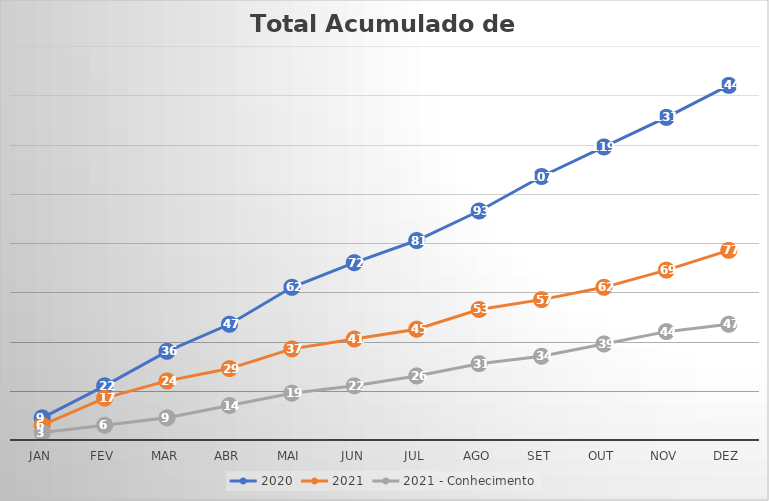
| Category | 2020 | 2021 | 2021 - Conhecimento |
|---|---|---|---|
| Jan | 9 | 6 | 3 |
| Fev | 22 | 17 | 6 |
| Mar | 36 | 24 | 9 |
| Abr | 47 | 29 | 14 |
| Mai | 62 | 37 | 19 |
| Jun | 72 | 41 | 22 |
| Jul | 81 | 45 | 26 |
| Ago | 93 | 53 | 31 |
| Set | 107 | 57 | 34 |
| Out | 119 | 62 | 39 |
| Nov | 131 | 69 | 44 |
| Dez | 144 | 77 | 47 |